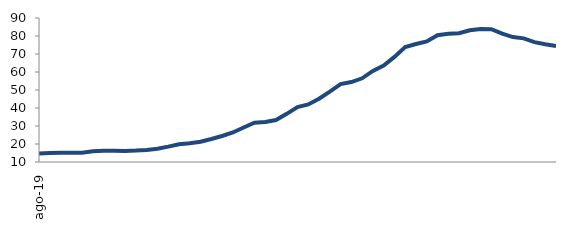
| Category | Series 0 |
|---|---|
| 2019-08-01 | 14.744 |
| 2019-09-01 | 15.056 |
| 2019-10-01 | 15.116 |
| 2019-11-01 | 15.185 |
| 2019-12-01 | 15.165 |
| 2020-01-01 | 15.917 |
| 2020-02-01 | 16.225 |
| 2020-03-01 | 16.228 |
| 2020-04-01 | 16.172 |
| 2020-05-01 | 16.362 |
| 2020-06-01 | 16.723 |
| 2020-07-01 | 17.365 |
| 2020-08-01 | 18.526 |
| 2020-09-01 | 19.846 |
| 2020-10-01 | 20.404 |
| 2020-11-01 | 21.294 |
| 2020-12-01 | 22.781 |
| 2021-01-01 | 24.447 |
| 2021-02-01 | 26.406 |
| 2021-03-01 | 29.172 |
| 2021-04-01 | 31.839 |
| 2021-05-01 | 32.208 |
| 2021-06-01 | 33.334 |
| 2021-07-01 | 36.745 |
| 2021-08-01 | 40.523 |
| 2021-09-01 | 41.963 |
| 2021-10-01 | 45.141 |
| 2021-11-01 | 49.115 |
| 2021-12-01 | 53.284 |
| 2022-01-01 | 54.418 |
| 2022-02-01 | 56.487 |
| 2022-03-01 | 60.62 |
| 2022-04-01 | 63.634 |
| 2022-05-01 | 68.377 |
| 2022-06-01 | 73.83 |
| 2022-07-01 | 75.57 |
| 2022-08-01 | 76.97 |
| 2022-09-01 | 80.415 |
| 2022-10-01 | 81.287 |
| 2022-11-01 | 81.539 |
| 2022-12-01 | 83.165 |
| 2023-01-01 | 83.881 |
| 2023-02-01 | 83.774 |
| 2023-03-01 | 81.297 |
| 2023-04-01 | 79.408 |
| 2023-05-01 | 78.7 |
| 2023-06-01 | 76.589 |
| 2023-07-01 | 75.386 |
| 2023-08-01 | 74.364 |